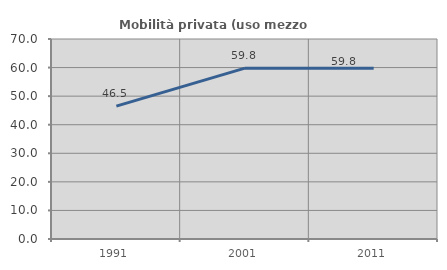
| Category | Mobilità privata (uso mezzo privato) |
|---|---|
| 1991.0 | 46.491 |
| 2001.0 | 59.794 |
| 2011.0 | 59.77 |